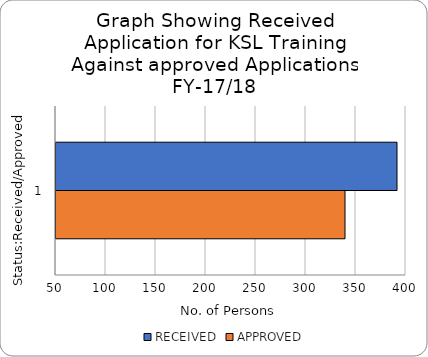
| Category | RECEIVED | APPROVED |
|---|---|---|
| 0 | 391 | 339 |